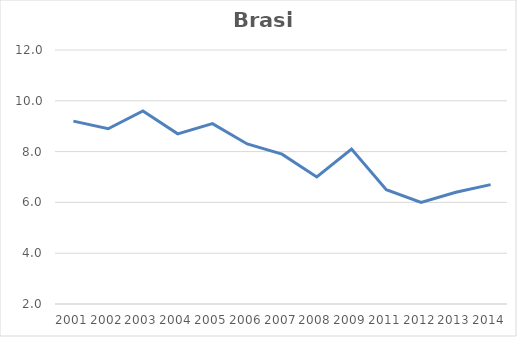
| Category | Total |
|---|---|
| 2001.0 | 9.2 |
| 2002.0 | 8.9 |
| 2003.0 | 9.6 |
| 2004.0 | 8.7 |
| 2005.0 | 9.1 |
| 2006.0 | 8.3 |
| 2007.0 | 7.9 |
| 2008.0 | 7 |
| 2009.0 | 8.1 |
| 2011.0 | 6.5 |
| 2012.0 | 6 |
| 2013.0 | 6.4 |
| 2014.0 | 6.7 |